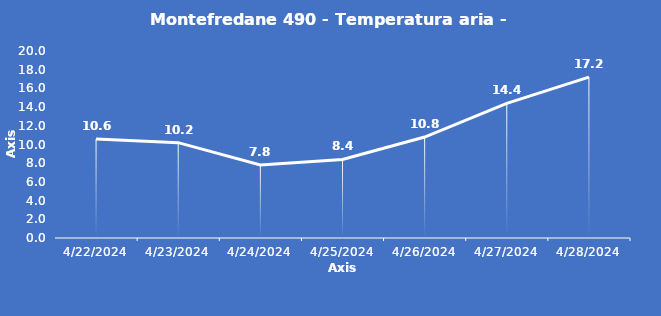
| Category | Montefredane 490 - Temperatura aria - Grezzo (°C) |
|---|---|
| 4/22/24 | 10.6 |
| 4/23/24 | 10.2 |
| 4/24/24 | 7.8 |
| 4/25/24 | 8.4 |
| 4/26/24 | 10.8 |
| 4/27/24 | 14.4 |
| 4/28/24 | 17.2 |